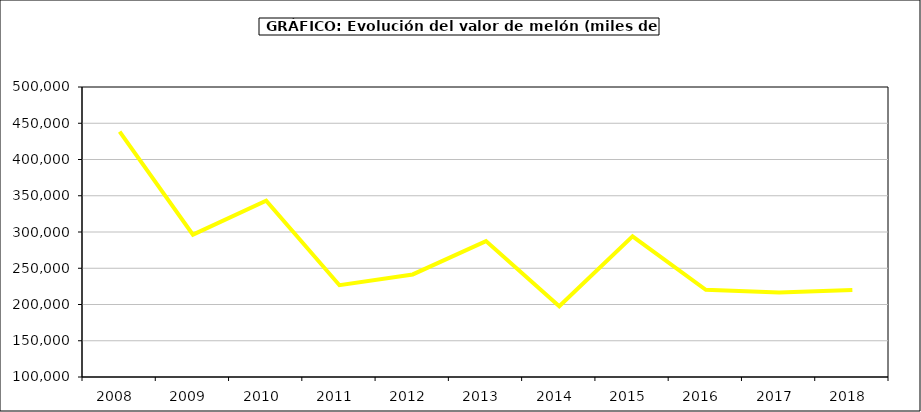
| Category | Valor |
|---|---|
| 2008.0 | 438449.843 |
| 2009.0 | 296322.107 |
| 2010.0 | 343061.749 |
| 2011.0 | 226631.76 |
| 2012.0 | 241464.672 |
| 2013.0 | 287421.365 |
| 2014.0 | 197555.814 |
| 2015.0 | 293985.4 |
| 2016.0 | 220336 |
| 2017.0 | 216504.545 |
| 2018.0 | 220100.149 |